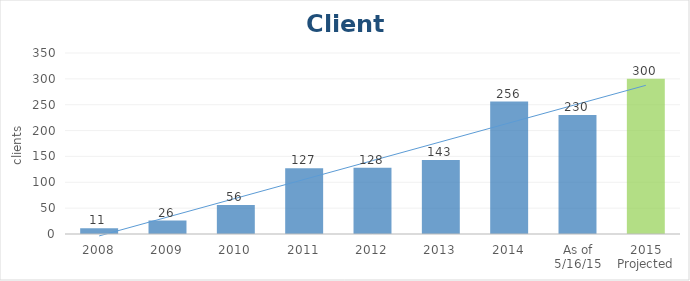
| Category | Clients |
|---|---|
| 2008 | 11 |
| 2009 | 26 |
| 2010 | 56 |
| 2011 | 127 |
| 2012 | 128 |
| 2013 | 143 |
| 2014 | 256 |
| As of 5/16/15 | 230 |
| 2015 Projected | 300 |